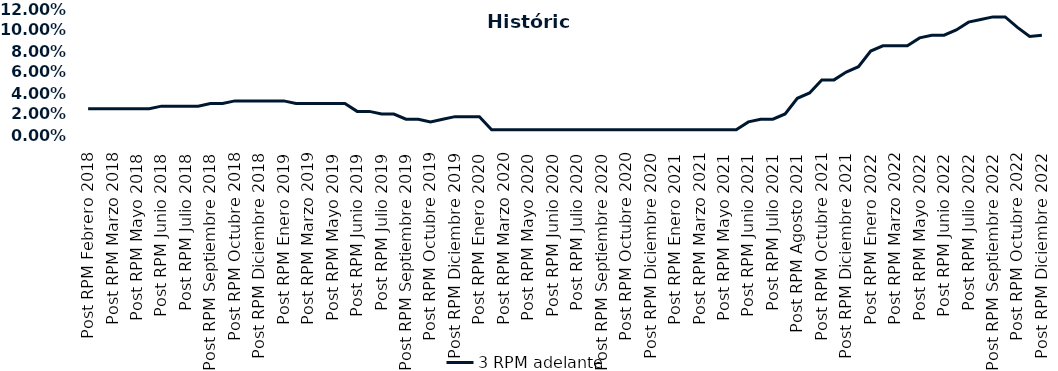
| Category | 3 RPM adelante |
|---|---|
| Post RPM Febrero 2018 | 0.025 |
| Pre RPM Marzo 2018 | 0.025 |
| Post RPM Marzo 2018 | 0.025 |
| Pre RPM Mayo 2018 | 0.025 |
| Post RPM Mayo 2018 | 0.025 |
| Pre RPM Junio 2018 | 0.025 |
| Post RPM Junio 2018 | 0.028 |
| Pre RPM Julio 2018 | 0.028 |
| Post RPM Julio 2018 | 0.028 |
| Pre RPM Septiembre 2018 | 0.028 |
| Post RPM Septiembre 2018 | 0.03 |
| Pre RPM Octubre 2018 | 0.03 |
| Post RPM Octubre 2018 | 0.032 |
| Pre RPM Diciembre 2018 | 0.032 |
| Post RPM Diciembre 2018 | 0.032 |
| Pre RPM Enero 2019 | 0.032 |
| Post RPM Enero 2019 | 0.032 |
| Pre RPM Marzo 2019 | 0.03 |
| Post RPM Marzo 2019 | 0.03 |
| Pre RPM Mayo 2019 | 0.03 |
| Post RPM Mayo 2019 | 0.03 |
| Pre RPM Junio 2019 | 0.03 |
| Post RPM Junio 2019 | 0.022 |
| Pre RPM Julio 2019 | 0.022 |
| Post RPM Julio 2019 | 0.02 |
| Pre RPM Septiembre 2019 | 0.02 |
| Post RPM Septiembre 2019 | 0.015 |
| Pre RPM Octubre 2019 | 0.015 |
| Post RPM Octubre 2019 | 0.012 |
| Pre RPM Diciembre 2019 | 0.015 |
| Post RPM Diciembre 2019 | 0.018 |
| Pre RPM Enero 2020 | 0.018 |
| Post RPM Enero 2020 | 0.018 |
| Pre RPM Marzo 2020 | 0.005 |
| Post RPM Marzo 2020 | 0.005 |
| Pre RPM Mayo 2020 | 0.005 |
| Post RPM Mayo 2020 | 0.005 |
| Pre RPM Junio 2020 | 0.005 |
| Post RPM Junio 2020 | 0.005 |
| Pre RPM Julio 2020 | 0.005 |
| Post RPM Julio 2020 | 0.005 |
| Pre RPM Septiembre 2020 | 0.005 |
| Post RPM Septiembre 2020 | 0.005 |
| Pre RPM Octubre 2020 | 0.005 |
| Post RPM Octubre 2020 | 0.005 |
| Pre RPM Diciembre 2020 | 0.005 |
| Post RPM Diciembre 2020 | 0.005 |
| Pre RPM Enero 2021 | 0.005 |
| Post RPM Enero 2021 | 0.005 |
| Pre RPM Marzo 2021 | 0.005 |
| Post RPM Marzo 2021 | 0.005 |
| Pre RPM Mayo 2021 | 0.005 |
| Post RPM Mayo 2021 | 0.005 |
| Pre RPM Junio 2021 | 0.005 |
| Post RPM Junio 2021 | 0.012 |
| Pre RPM Julio 2021 | 0.015 |
| Post RPM Julio 2021 | 0.015 |
| Pre RPM Agosto 2021 | 0.02 |
| Post RPM Agosto 2021 | 0.035 |
| Pre RPM Octubre 2021 | 0.04 |
| Post RPM Octubre 2021 | 0.052 |
| Pre RPM Diciembre 2021 | 0.052 |
| Post RPM Diciembre 2021 | 0.06 |
| Pre RPM Enero 2022 | 0.065 |
| Post RPM Enero 2022 | 0.08 |
| Pre RPM Marzo 2022 | 0.085 |
| Post RPM Marzo 2022 | 0.085 |
| Pre RPM Mayo 2022 | 0.085 |
| Post RPM Mayo 2022 | 0.092 |
| Pre RPM Junio 2022 | 0.095 |
| Post RPM Junio 2022 | 0.095 |
| Pre RPM Julio 2022 | 0.1 |
| Post RPM Julio 2022 | 0.108 |
| Pre RPM Septiembre 2022 | 0.11 |
| Post RPM Septiembre 2022 | 0.112 |
| Pre RPM Octubre 2022 | 0.112 |
| Post RPM Octubre 2022 | 0.102 |
| Pre RPM Diciembre 2022 | 0.094 |
| Post RPM Diciembre 2022 | 0.095 |